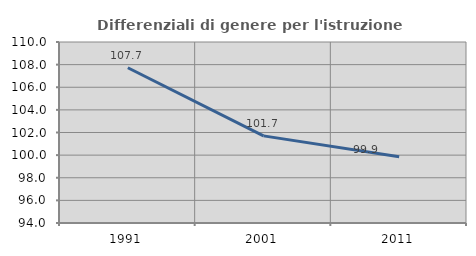
| Category | Differenziali di genere per l'istruzione superiore |
|---|---|
| 1991.0 | 107.721 |
| 2001.0 | 101.702 |
| 2011.0 | 99.85 |